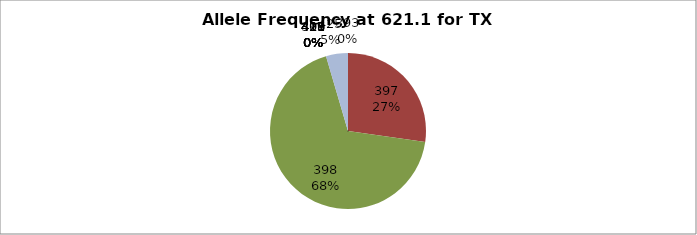
| Category | Series 0 |
|---|---|
| 393.0 | 0 |
| 397.0 | 0.273 |
| 398.0 | 0.682 |
| 399.0 | 0 |
| 400.0 | 0 |
| 413.0 | 0 |
| 415.0 | 0 |
| 417.0 | 0 |
| 418.0 | 0 |
| 419.0 | 0 |
| 421.0 | 0 |
| 423.0 | 0 |
| 425.0 | 0.045 |